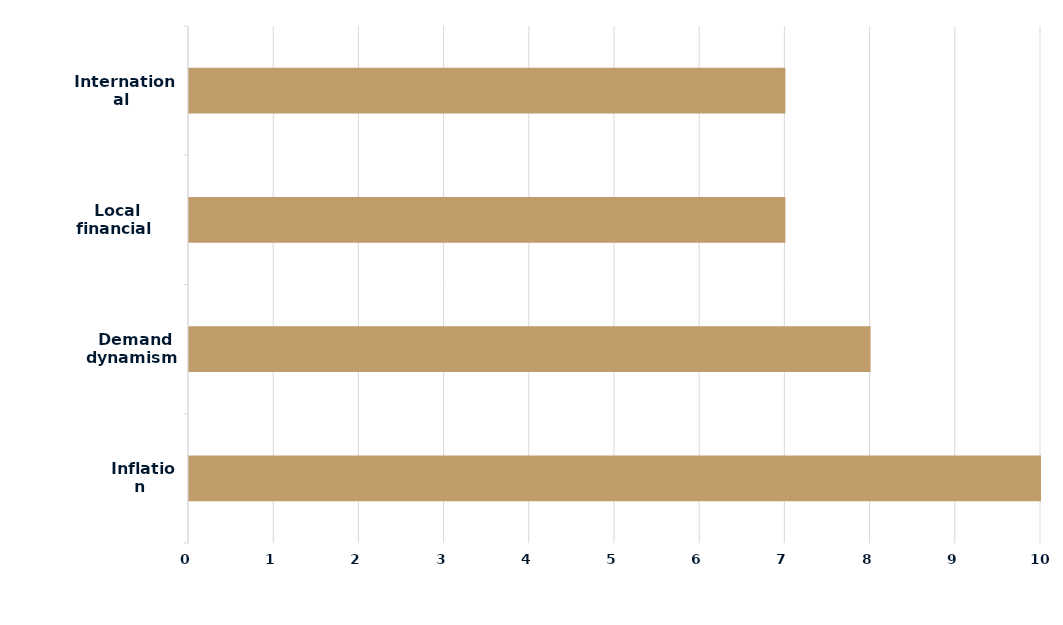
| Category | Series 0 |
|---|---|
|  Inflation | 10 |
|  Demand dynamism | 8 |
|  Local financial conditions | 7 |
|  International environment | 7 |